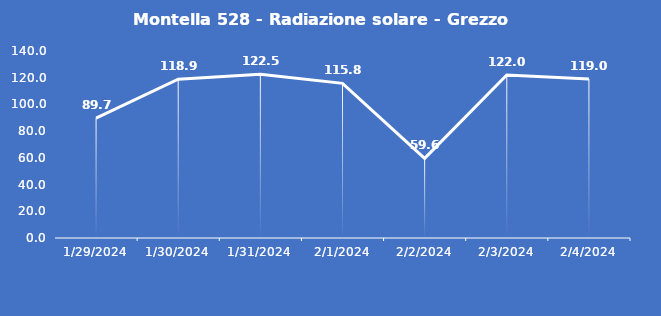
| Category | Montella 528 - Radiazione solare - Grezzo (W/m2) |
|---|---|
| 1/29/24 | 89.7 |
| 1/30/24 | 118.9 |
| 1/31/24 | 122.5 |
| 2/1/24 | 115.8 |
| 2/2/24 | 59.6 |
| 2/3/24 | 122 |
| 2/4/24 | 119 |